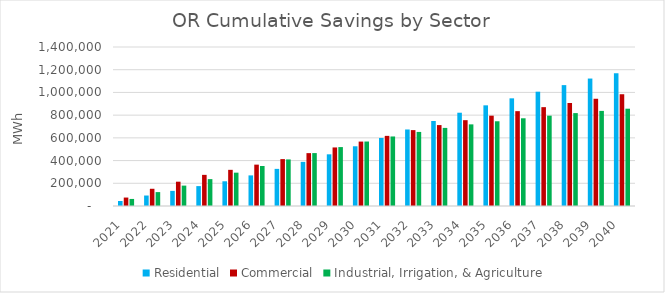
| Category |  Residential  |  Commercial  |  Industrial, Irrigation, & Agriculture  |
|---|---|---|---|
|  2021  | 44184.102 | 74365.269 | 62172.875 |
|  2022  | 92291.155 | 151676.563 | 122438.573 |
|  2023  | 133193.673 | 214072.885 | 179548.255 |
|  2024  | 175166.832 | 274198.879 | 236697.787 |
|  2025  | 217653.669 | 318426.037 | 293528.357 |
|  2026  | 269481.61 | 364223.632 | 352378.734 |
|  2027  | 326860.007 | 412836.17 | 410106.695 |
|  2028  | 388687.274 | 465525.524 | 465942.576 |
|  2029  | 455072.571 | 515601.548 | 518780.392 |
|  2030  | 525792.171 | 567194.811 | 567733.631 |
|  2031  | 599113.69 | 617494.753 | 612273.896 |
|  2032  | 673767.07 | 668209.795 | 652207.947 |
|  2033  | 748443.809 | 712458.345 | 687614.509 |
|  2034  | 821348.982 | 755717.3 | 718765.638 |
|  2035  | 886390.523 | 795364.765 | 746051.17 |
|  2036  | 947939.725 | 835100.49 | 772418.531 |
|  2037  | 1006463.667 | 870373.557 | 795360.034 |
|  2038  | 1064365.248 | 907069.203 | 818033.723 |
|  2039  | 1122221.013 | 944220.177 | 837409.039 |
|  2040  | 1169812.918 | 984048.05 | 856746.068 |